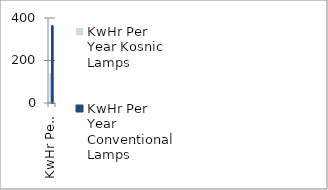
| Category | KwHr Per Year Kosnic Lamps | KwHr Per Year Conventional Lamps |
|---|---|---|
| 0 | 140 | 364 |